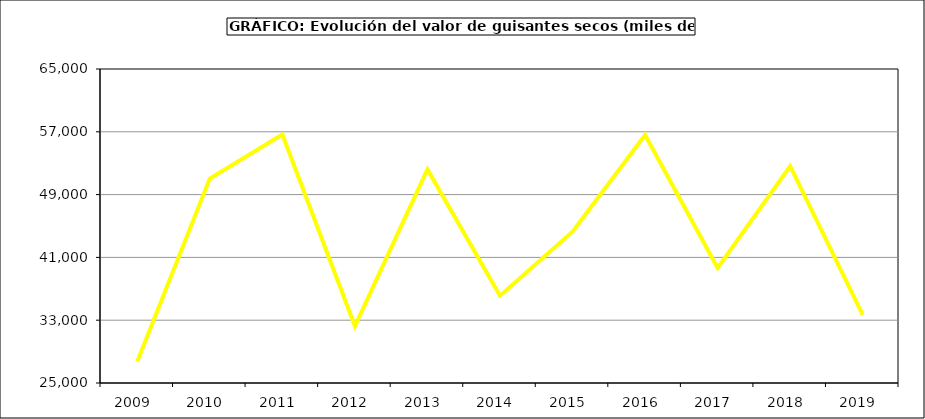
| Category | Valor |
|---|---|
| 2009.0 | 27725.625 |
| 2010.0 | 51044.567 |
| 2011.0 | 56666.277 |
| 2012.0 | 32251.03 |
| 2013.0 | 52203.832 |
| 2014.0 | 36116.283 |
| 2015.0 | 44267 |
| 2016.0 | 56599 |
| 2017.0 | 39648.556 |
| 2018.0 | 52618.427 |
| 2019.0 | 33672.184 |